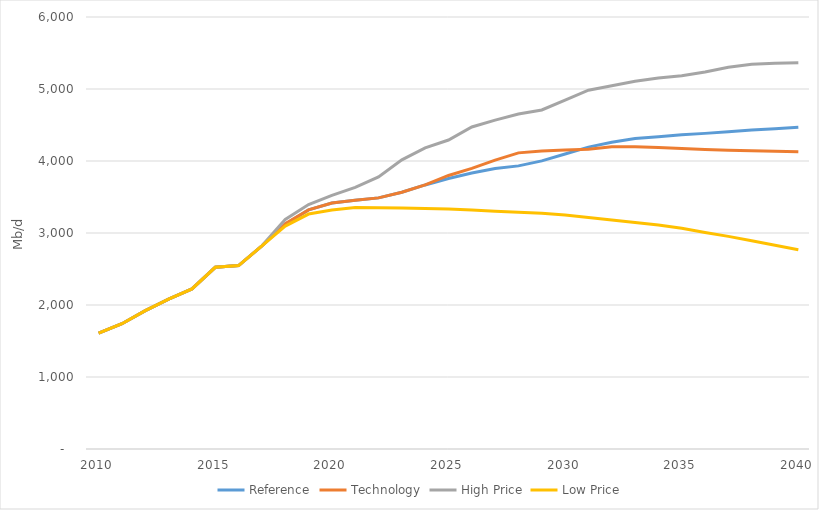
| Category | Reference | Technology | High Price | Low Price |
|---|---|---|---|---|
| 2010.0 | 1609.385 | 1609.385 | 1609.385 | 1609.385 |
| 2011.0 | 1739.876 | 1739.876 | 1739.876 | 1739.876 |
| 2012.0 | 1922.172 | 1922.172 | 1922.172 | 1922.172 |
| 2013.0 | 2082.158 | 2082.158 | 2082.158 | 2082.158 |
| 2014.0 | 2222.828 | 2222.828 | 2222.828 | 2222.828 |
| 2015.0 | 2523.264 | 2523.264 | 2523.264 | 2523.264 |
| 2016.0 | 2548.251 | 2548.251 | 2548.251 | 2548.251 |
| 2017.0 | 2822.426 | 2822.426 | 2822.426 | 2822.426 |
| 2018.0 | 3122.509 | 3129.717 | 3187.784 | 3095.948 |
| 2019.0 | 3320.473 | 3320.473 | 3394.358 | 3263.216 |
| 2020.0 | 3417.244 | 3417.244 | 3522.484 | 3318.401 |
| 2021.0 | 3455.292 | 3455.292 | 3634.293 | 3353.161 |
| 2022.0 | 3487.752 | 3487.752 | 3778.376 | 3349.636 |
| 2023.0 | 3565.693 | 3565.693 | 4016.059 | 3345.894 |
| 2024.0 | 3667.587 | 3667.587 | 4182.408 | 3340.964 |
| 2025.0 | 3757.755 | 3798.967 | 4291.655 | 3331.786 |
| 2026.0 | 3833.245 | 3898.058 | 4473.107 | 3317.97 |
| 2027.0 | 3895.056 | 4011.516 | 4568.063 | 3302.633 |
| 2028.0 | 3932.061 | 4112.887 | 4653.418 | 3287.92 |
| 2029.0 | 4001.407 | 4137.729 | 4708.984 | 3273.789 |
| 2030.0 | 4096.484 | 4153.426 | 4846.872 | 3250.102 |
| 2031.0 | 4192.712 | 4162.644 | 4983.63 | 3216.13 |
| 2032.0 | 4259.408 | 4197.826 | 5045.52 | 3180.694 |
| 2033.0 | 4310.902 | 4199.582 | 5106.646 | 3146.199 |
| 2034.0 | 4335.39 | 4186.922 | 5152.562 | 3112.584 |
| 2035.0 | 4364.025 | 4172.221 | 5183.724 | 3065.024 |
| 2036.0 | 4383.665 | 4159.458 | 5236.953 | 3007.654 |
| 2037.0 | 4407.554 | 4150.274 | 5300.983 | 2953.099 |
| 2038.0 | 4430.589 | 4142.801 | 5343.057 | 2892.924 |
| 2039.0 | 4448.844 | 4135.316 | 5357.224 | 2828.945 |
| 2040.0 | 4467.243 | 4127.82 | 5365.32 | 2768.355 |